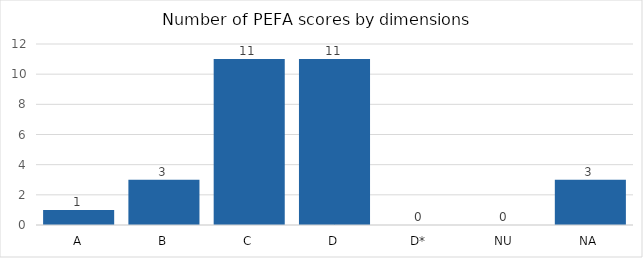
| Category |   | 2022 |
|---|---|---|
| A |  | 1 |
| B |  | 3 |
| C |  | 11 |
| D |  | 11 |
| D* |  | 0 |
| NU |  | 0 |
| NA |  | 3 |